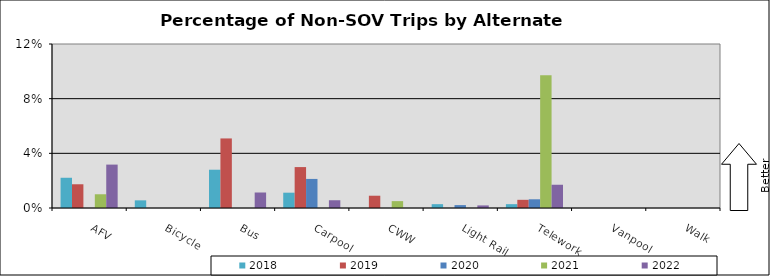
| Category | 2018 | 2019 | 2020 | 2021 | 2022 |
|---|---|---|---|---|---|
| AFV | 0.022 | 0.017 | 0 | 0.01 | 0.032 |
| Bicycle | 0.006 | 0 | 0 | 0 | 0 |
| Bus | 0.028 | 0.051 | 0 | 0 | 0.011 |
| Carpool | 0.011 | 0.03 | 0.021 | 0 | 0.006 |
| CWW | 0 | 0.009 | 0 | 0.005 | 0 |
| Light Rail | 0.003 | 0 | 0.002 | 0 | 0.002 |
| Telework | 0.003 | 0.006 | 0.006 | 0.097 | 0.017 |
| Vanpool | 0 | 0 | 0 | 0 | 0 |
| Walk | 0 | 0 | 0 | 0 | 0 |